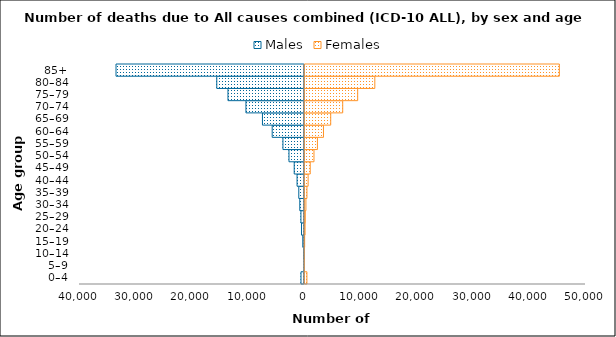
| Category | Males | Females |
|---|---|---|
| 0–4 | -605 | 535 |
| 5–9 | -80 | 60 |
| 10–14 | -89 | 61 |
| 15–19 | -285 | 134 |
| 20–24 | -515 | 211 |
| 25–29 | -616 | 245 |
| 30–34 | -817 | 361 |
| 35–39 | -997 | 542 |
| 40–44 | -1302 | 752 |
| 45–49 | -1809 | 1130 |
| 50–54 | -2740 | 1794 |
| 55–59 | -3813 | 2408 |
| 60–64 | -5725 | 3484 |
| 65–69 | -7458 | 4771 |
| 70–74 | -10395 | 6904 |
| 75–79 | -13590 | 9567 |
| 80–84 | -15583 | 12616 |
| 85+ | -33503 | 45437 |